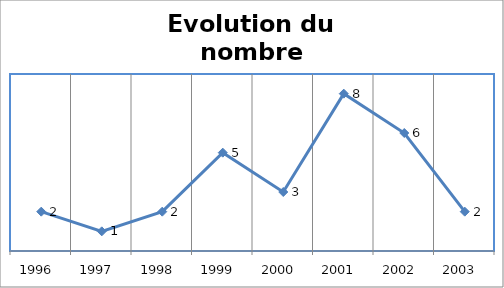
| Category | Total |
|---|---|
| 1996  | 2 |
| 1997  | 1 |
| 1998  | 2 |
| 1999  | 5 |
| 2000  | 3 |
| 2001  | 8 |
| 2002  | 6 |
| 2003  | 2 |